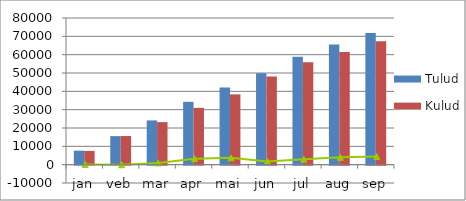
| Category | Tulud | Kulud |
|---|---|---|
| jan | 7632.244 | 7482.976 |
| veb | 15580.733 | 15615.499 |
| mar | 24135.431 | 23209.796 |
| apr | 34278.616 | 30987.751 |
| mai | 42090.745 | 38346.267 |
| jun | 49889.792 | 48153.685 |
| jul | 58878.572 | 55892.734 |
| aug | 65520.162 | 61515.81 |
| sep | 71808.1 | 67349.603 |